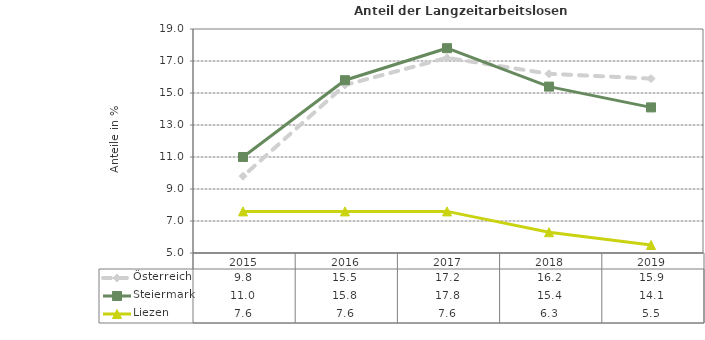
| Category | Österreich | Steiermark | Liezen |
|---|---|---|---|
| 2019.0 | 15.9 | 14.1 | 5.5 |
| 2018.0 | 16.2 | 15.4 | 6.3 |
| 2017.0 | 17.2 | 17.8 | 7.6 |
| 2016.0 | 15.5 | 15.8 | 7.6 |
| 2015.0 | 9.8 | 11 | 7.6 |